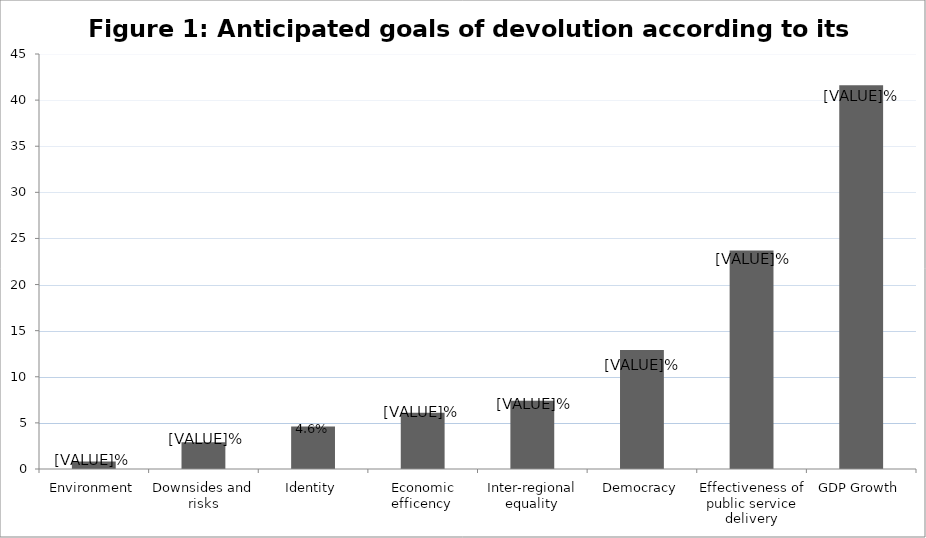
| Category | Series 0 |
|---|---|
| Environment | 0.8 |
| Downsides and risks | 2.9 |
| Identity | 4.6 |
| Economic efficency  | 6.1 |
| Inter-regional equality | 7.4 |
| Democracy | 12.9 |
| Effectiveness of public service delivery | 23.7 |
| GDP Growth | 41.6 |